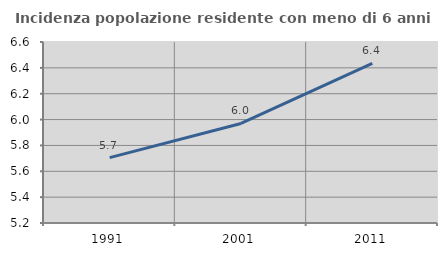
| Category | Incidenza popolazione residente con meno di 6 anni |
|---|---|
| 1991.0 | 5.706 |
| 2001.0 | 5.97 |
| 2011.0 | 6.434 |